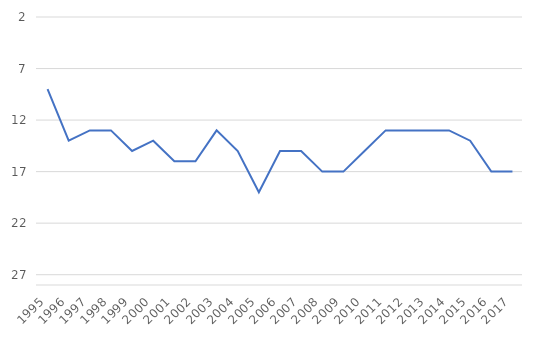
| Category | Australia's rank |
|---|---|
| 1995.0 | 9 |
| 1996.0 | 14 |
| 1997.0 | 13 |
| 1998.0 | 13 |
| 1999.0 | 15 |
| 2000.0 | 14 |
| 2001.0 | 16 |
| 2002.0 | 16 |
| 2003.0 | 13 |
| 2004.0 | 15 |
| 2005.0 | 19 |
| 2006.0 | 15 |
| 2007.0 | 15 |
| 2008.0 | 17 |
| 2009.0 | 17 |
| 2010.0 | 15 |
| 2011.0 | 13 |
| 2012.0 | 13 |
| 2013.0 | 13 |
| 2014.0 | 13 |
| 2015.0 | 14 |
| 2016.0 | 17 |
| 2017.0 | 17 |